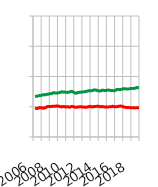
| Category | Vollzeit | Teilzeit |
|---|---|---|
| 2006.0 | 47700 | 67400 |
| 2006.0 | 47000 | 67400 |
| 2006.0 | 48200 | 68400 |
| 2006.0 | 48300 | 68800 |
| 2007.0 | 47700 | 69800 |
| 2007.0 | 48200 | 69700 |
| 2007.0 | 50200 | 70600 |
| 2007.0 | 50600 | 71300 |
| 2008.0 | 50500 | 71400 |
| 2008.0 | 50800 | 73100 |
| 2008.0 | 50900 | 72800 |
| 2008.0 | 51400 | 72700 |
| 2009.0 | 50500 | 73400 |
| 2009.0 | 49700 | 74600 |
| 2009.0 | 50600 | 74500 |
| 2009.0 | 49700 | 74000 |
| 2010.0 | 50000 | 73700 |
| 2010.0 | 49300 | 74500 |
| 2010.0 | 50500 | 75500 |
| 2010.0 | 50100 | 73900 |
| 2011.0 | 49000 | 72300 |
| 2011.0 | 49600 | 73400 |
| 2011.0 | 50000 | 74000 |
| 2011.0 | 49800 | 74300 |
| 2012.0 | 49400 | 74700 |
| 2012.0 | 49100 | 75200 |
| 2012.0 | 49900 | 76200 |
| 2012.0 | 50700 | 76400 |
| 2013.0 | 49600 | 76700 |
| 2013.0 | 50500 | 77800 |
| 2013.0 | 50600 | 77500 |
| 2013.0 | 51000 | 76300 |
| 2014.0 | 50000 | 76100 |
| 2014.0 | 50400 | 77300 |
| 2014.0 | 49700 | 77000 |
| 2014.0 | 49800 | 77000 |
| 2015.0 | 49700 | 77800 |
| 2015.0 | 50000 | 76900 |
| 2015.0 | 50700 | 76700 |
| 2015.0 | 50200 | 76500 |
| 2016.0 | 50000 | 78300 |
| 2016.0 | 50800 | 78700 |
| 2016.0 | 51200 | 78300 |
| 2016.0 | 50500 | 79600 |
| 2017.0 | 49200 | 79700 |
| 2017.0 | 48800 | 79300 |
| 2017.0 | 48900 | 79500 |
| 2017.0 | 48200 | 80300 |
| 2018.0 | 48200 | 80200 |
| 2018.0 | 48100 | 80600 |
| 2018.0 | 48300 | 81800 |
| 2018.0 | 48500 | 81200 |